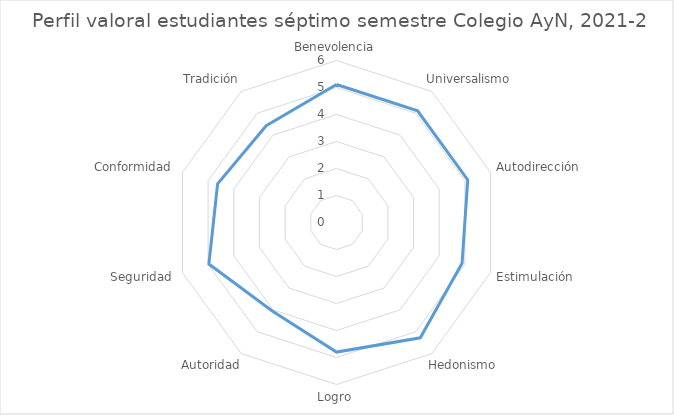
| Category | Series 0 |
|---|---|
| Benevolencia | 5.11 |
| Universalismo | 5.11 |
| Autodirección | 5.11 |
| Estimulación | 4.89 |
| Hedonismo | 5.28 |
| Logro | 4.8 |
| Autoridad | 4.05 |
| Seguridad | 4.97 |
| Conformidad | 4.63 |
| Tradición | 4.43 |